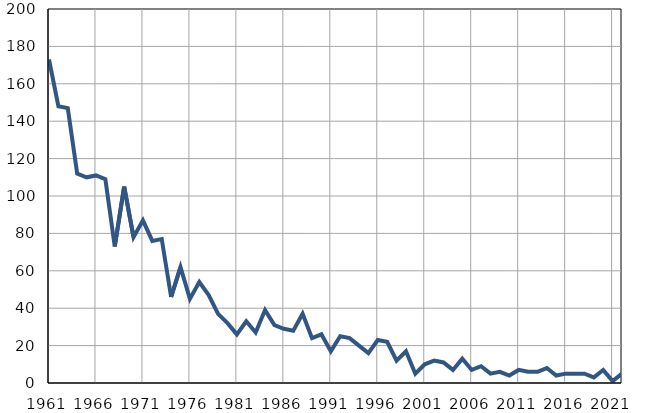
| Category | Умрла 
одојчад |
|---|---|
| 1961.0 | 173 |
| 1962.0 | 148 |
| 1963.0 | 147 |
| 1964.0 | 112 |
| 1965.0 | 110 |
| 1966.0 | 111 |
| 1967.0 | 109 |
| 1968.0 | 73 |
| 1969.0 | 105 |
| 1970.0 | 78 |
| 1971.0 | 87 |
| 1972.0 | 76 |
| 1973.0 | 77 |
| 1974.0 | 46 |
| 1975.0 | 62 |
| 1976.0 | 45 |
| 1977.0 | 54 |
| 1978.0 | 47 |
| 1979.0 | 37 |
| 1980.0 | 32 |
| 1981.0 | 26 |
| 1982.0 | 33 |
| 1983.0 | 27 |
| 1984.0 | 39 |
| 1985.0 | 31 |
| 1986.0 | 29 |
| 1987.0 | 28 |
| 1988.0 | 37 |
| 1989.0 | 24 |
| 1990.0 | 26 |
| 1991.0 | 17 |
| 1992.0 | 25 |
| 1993.0 | 24 |
| 1994.0 | 20 |
| 1995.0 | 16 |
| 1996.0 | 23 |
| 1997.0 | 22 |
| 1998.0 | 12 |
| 1999.0 | 17 |
| 2000.0 | 5 |
| 2001.0 | 10 |
| 2002.0 | 12 |
| 2003.0 | 11 |
| 2004.0 | 7 |
| 2005.0 | 13 |
| 2006.0 | 7 |
| 2007.0 | 9 |
| 2008.0 | 5 |
| 2009.0 | 6 |
| 2010.0 | 4 |
| 2011.0 | 7 |
| 2012.0 | 6 |
| 2013.0 | 6 |
| 2014.0 | 8 |
| 2015.0 | 4 |
| 2016.0 | 5 |
| 2017.0 | 5 |
| 2018.0 | 5 |
| 2019.0 | 3 |
| 2020.0 | 7 |
| 2021.0 | 1 |
| 2022.0 | 5 |